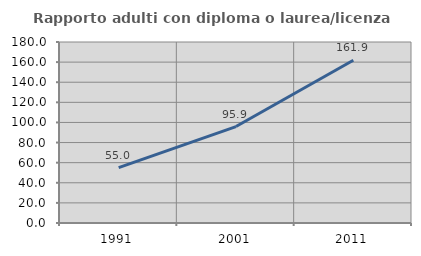
| Category | Rapporto adulti con diploma o laurea/licenza media  |
|---|---|
| 1991.0 | 55.046 |
| 2001.0 | 95.922 |
| 2011.0 | 161.902 |